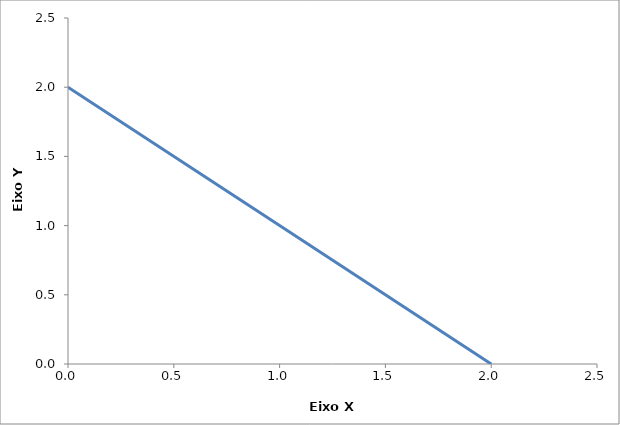
| Category | Series 0 |
|---|---|
| 0.0 | 2 |
| 2.0 | 0 |